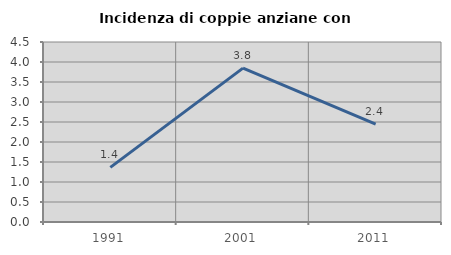
| Category | Incidenza di coppie anziane con figli |
|---|---|
| 1991.0 | 1.365 |
| 2001.0 | 3.846 |
| 2011.0 | 2.448 |